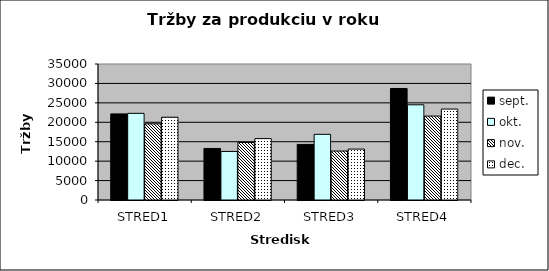
| Category | sept. | okt. | nov. | dec. |
|---|---|---|---|---|
| STRED1 | 22160 | 22300 | 19600 | 21300 |
| STRED2 | 13262 | 12500 | 14800 | 15800 |
| STRED3 | 14300 | 16900 | 12600 | 13100 |
| STRED4 | 28700 | 24500 | 21600 | 23400 |